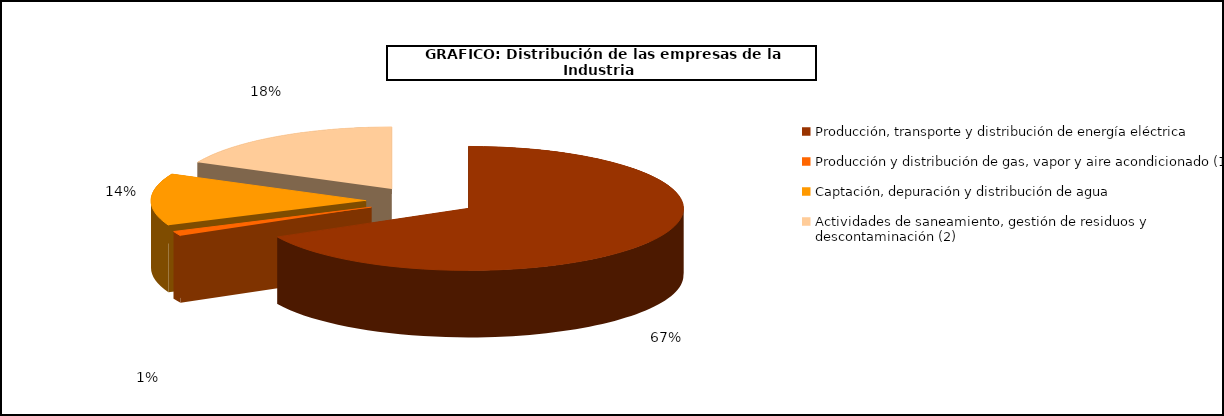
| Category | Series 0 |
|---|---|
| Producción, transporte y distribución de energía eléctrica | 14571 |
| Producción y distribución de gas, vapor y aire acondicionado (1) | 255 |
| Captación, depuración y distribución de agua | 2924 |
| Actividades de saneamiento, gestión de residuos y descontaminación (2) | 3878 |